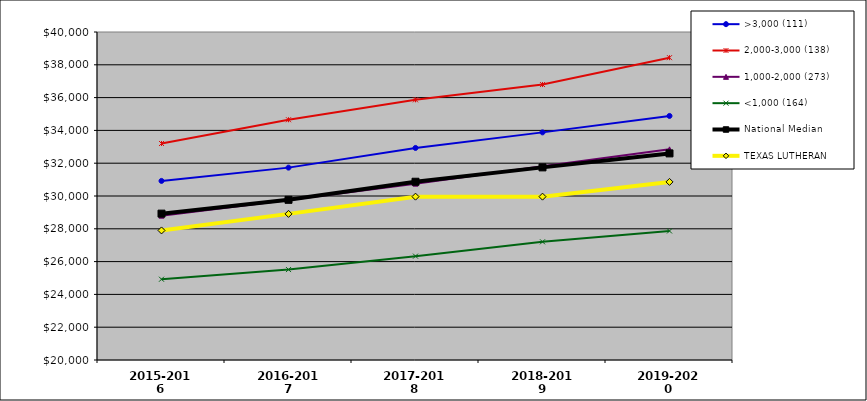
| Category | >3,000 (111) | 2,000-3,000 (138) | 1,000-2,000 (273) | <1,000 (164) | National Median | TEXAS LUTHERAN |
|---|---|---|---|---|---|---|
| 2015-2016 | 30920 | 33202 | 28800 | 24925 | 28924.5 | 27900 |
| 2016-2017 | 31730 | 34650 | 29752 | 25514 | 29767 | 28910 |
| 2017-2018 | 32930 | 35865 | 30752 | 26333 | 30869 | 29960 |
| 2018-2019 | 33880 | 36795 | 31810 | 27206 | 31745 | 29960 |
| 2019-2020 | 34882 | 38435 | 32845 | 27868 | 32598 | 30860 |